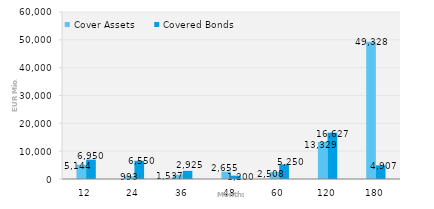
| Category | Cover Assets | Covered Bonds |
|---|---|---|
| 12.0 | 5143.9 | 6950 |
| 24.0 | 993.22 | 6550 |
| 36.0 | 1537.47 | 2925 |
| 48.0 | 2655.2 | 1200 |
| 60.0 | 2508.38 | 5250 |
| 120.0 | 13328.84 | 16627.2 |
| 180.0 | 49328.46 | 4907 |